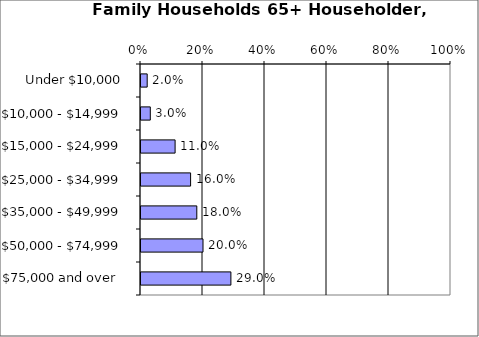
| Category | Series 0 |
|---|---|
| Under $10,000 | 0.02 |
| $10,000 - $14,999 | 0.03 |
| $15,000 - $24,999 | 0.11 |
| $25,000 - $34,999 | 0.16 |
| $35,000 - $49,999 | 0.18 |
| $50,000 - $74,999 | 0.2 |
| $75,000 and over  | 0.29 |